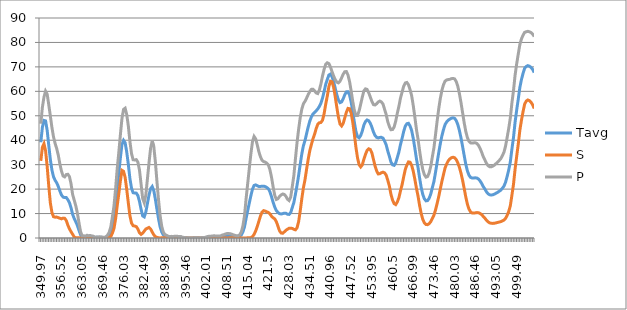
| Category | Tavg | S | P |
|---|---|---|---|
| 349.97 | 39.16 | 31.555 | 46.765 |
| 350.48 | 45.298 | 37.122 | 53.475 |
| 350.99 | 48.093 | 38.547 | 57.639 |
| 351.5 | 47.901 | 35.73 | 60.073 |
| 352.01 | 44.091 | 29.308 | 58.875 |
| 352.52 | 37.928 | 21.343 | 54.514 |
| 353.02 | 32.137 | 14.359 | 49.915 |
| 353.53 | 27.799 | 10.416 | 45.183 |
| 354.03 | 25.027 | 8.699 | 41.356 |
| 354.53 | 23.6 | 8.532 | 38.668 |
| 355.03 | 22.561 | 8.548 | 36.573 |
| 355.53 | 21.086 | 8.332 | 33.841 |
| 356.03 | 19.175 | 8.072 | 30.277 |
| 356.52 | 17.587 | 7.842 | 27.331 |
| 357.01 | 16.753 | 8.133 | 25.373 |
| 357.51 | 16.535 | 8.057 | 25.013 |
| 358.0 | 16.554 | 7.152 | 25.956 |
| 358.49 | 15.666 | 5.267 | 26.065 |
| 358.97 | 14.422 | 3.735 | 25.109 |
| 359.46 | 12.384 | 2.574 | 22.193 |
| 360.06 | 9.675 | 1.526 | 17.825 |
| 360.55 | 7.944 | 0.421 | 15.466 |
| 361.03 | 6.59 | 0.038 | 13.141 |
| 361.5 | 5.116 | 0.077 | 10.156 |
| 361.98 | 3.133 | 0.077 | 6.188 |
| 362.46 | 1.276 | 0 | 2.553 |
| 363.05 | 0.481 | 0.078 | 0.885 |
| 363.52 | 0.561 | 0.196 | 0.926 |
| 363.98 | 0.356 | 0 | 0.713 |
| 364.45 | 0.686 | 0.237 | 1.134 |
| 365.03 | 0.465 | 0 | 0.93 |
| 365.49 | 0.563 | 0.078 | 1.048 |
| 365.95 | 0.479 | 0.118 | 0.839 |
| 366.53 | 0.455 | 0.156 | 0.754 |
| 366.98 | 0.185 | 0.078 | 0.292 |
| 367.55 | 0.288 | 0.158 | 0.419 |
| 368.0 | 0.29 | 0.198 | 0.381 |
| 368.45 | 0.331 | 0.281 | 0.38 |
| 369.01 | 0.295 | 0.161 | 0.428 |
| 369.46 | 0.174 | 0 | 0.348 |
| 370.01 | 0.151 | 0.082 | 0.219 |
| 370.45 | 0.389 | 0.207 | 0.571 |
| 371.0 | 0.802 | 0.415 | 1.188 |
| 371.55 | 1.194 | 0 | 2.389 |
| 371.98 | 2.618 | 0.622 | 4.613 |
| 372.52 | 5.367 | 2.004 | 8.73 |
| 372.95 | 8.61 | 3.974 | 13.245 |
| 373.49 | 14.014 | 7.812 | 20.217 |
| 374.02 | 20.702 | 13.122 | 28.283 |
| 374.45 | 26.487 | 18.056 | 34.918 |
| 374.98 | 32.782 | 23.343 | 42.22 |
| 375.51 | 38.312 | 27.683 | 48.941 |
| 376.03 | 39.936 | 27.264 | 52.609 |
| 376.45 | 38.932 | 24.763 | 53.101 |
| 376.97 | 35.145 | 19.817 | 50.474 |
| 377.49 | 30.066 | 14.314 | 45.819 |
| 378.01 | 24.27 | 9.13 | 39.41 |
| 378.52 | 20.338 | 6.122 | 34.554 |
| 379.04 | 18.518 | 5.024 | 32.013 |
| 379.55 | 18.402 | 4.883 | 31.921 |
| 379.96 | 18.359 | 4.658 | 32.06 |
| 380.47 | 17.346 | 3.653 | 31.039 |
| 380.97 | 14.967 | 2.115 | 27.819 |
| 381.48 | 11.777 | 1.475 | 22.08 |
| 381.98 | 9.054 | 1.959 | 16.149 |
| 382.49 | 8.633 | 2.841 | 14.426 |
| 382.99 | 10.648 | 3.679 | 17.616 |
| 383.49 | 14.117 | 4.005 | 24.229 |
| 383.99 | 17.59 | 4.33 | 30.85 |
| 384.49 | 20.206 | 3.685 | 36.727 |
| 384.99 | 21.055 | 2.432 | 39.677 |
| 385.49 | 19.35 | 1.305 | 37.395 |
| 385.99 | 15.795 | 0.532 | 31.058 |
| 386.49 | 11.602 | 0.261 | 22.943 |
| 386.99 | 7.741 | 0.102 | 15.381 |
| 387.49 | 4.504 | 0 | 9.008 |
| 387.99 | 2.434 | 0.148 | 4.719 |
| 388.48 | 1.242 | 0.145 | 2.338 |
| 388.98 | 0.742 | 0.095 | 1.389 |
| 389.48 | 0.541 | 0 | 1.083 |
| 389.98 | 0.369 | 0 | 0.738 |
| 390.49 | 0.296 | 0 | 0.592 |
| 390.99 | 0.336 | 0 | 0.672 |
| 391.49 | 0.33 | 0.044 | 0.616 |
| 392.0 | 0.347 | 0 | 0.695 |
| 392.5 | 0.363 | 0 | 0.726 |
| 393.01 | 0.336 | 0 | 0.673 |
| 393.51 | 0.329 | 0.041 | 0.618 |
| 394.02 | 0.304 | 0 | 0.609 |
| 394.54 | 0.18 | 0.04 | 0.32 |
| 395.05 | 0.119 | 0 | 0.237 |
| 395.46 | 0.136 | 0.116 | 0.156 |
| 395.97 | 0.058 | 0.038 | 0.077 |
| 396.49 | 0.038 | 0 | 0.076 |
| 397.01 | 0.019 | 0.037 | 0 |
| 397.53 | 0.018 | 0 | 0.037 |
| 397.95 | 0.073 | 0.072 | 0.073 |
| 398.48 | 0.054 | 0 | 0.108 |
| 399.01 | 0.053 | 0.035 | 0.071 |
| 399.54 | 0.087 | 0.069 | 0.104 |
| 399.96 | 0.034 | 0.034 | 0.035 |
| 400.5 | 0.068 | 0 | 0.136 |
| 401.04 | 0.084 | 0 | 0.168 |
| 401.47 | 0.133 | 0.066 | 0.199 |
| 402.01 | 0.229 | 0.033 | 0.426 |
| 402.45 | 0.325 | 0 | 0.65 |
| 402.99 | 0.352 | 0 | 0.704 |
| 403.54 | 0.411 | 0.063 | 0.759 |
| 403.99 | 0.453 | 0.062 | 0.844 |
| 404.54 | 0.448 | 0 | 0.896 |
| 404.99 | 0.413 | 0 | 0.827 |
| 405.55 | 0.423 | 0.03 | 0.816 |
| 406.0 | 0.405 | 0 | 0.81 |
| 406.45 | 0.46 | 0.059 | 0.86 |
| 407.02 | 0.644 | 0.088 | 1.201 |
| 407.48 | 0.695 | 0.029 | 1.362 |
| 408.05 | 0.846 | 0.057 | 1.634 |
| 408.51 | 0.906 | 0 | 1.813 |
| 408.97 | 0.941 | 0.057 | 1.826 |
| 409.55 | 0.903 | 0.056 | 1.751 |
| 410.02 | 0.824 | 0.111 | 1.538 |
| 410.49 | 0.681 | 0.082 | 1.281 |
| 410.96 | 0.581 | 0.081 | 1.081 |
| 411.55 | 0.522 | 0.108 | 0.936 |
| 412.03 | 0.504 | 0.053 | 0.955 |
| 412.5 | 0.736 | 0.132 | 1.341 |
| 412.98 | 1.264 | 0.026 | 2.502 |
| 413.46 | 2.514 | 0.052 | 4.976 |
| 413.94 | 4.594 | 0.026 | 9.162 |
| 414.55 | 8.071 | 0 | 16.143 |
| 415.04 | 11.21 | 0.101 | 22.319 |
| 415.52 | 14.301 | 0.1 | 28.502 |
| 416.01 | 17.319 | 0.15 | 34.489 |
| 416.5 | 19.989 | 0.566 | 39.412 |
| 417.0 | 21.506 | 1.46 | 41.551 |
| 417.49 | 21.727 | 2.88 | 40.575 |
| 417.99 | 21.394 | 4.699 | 38.09 |
| 418.48 | 21.076 | 6.831 | 35.322 |
| 418.98 | 21.093 | 8.966 | 33.219 |
| 419.48 | 21.207 | 10.603 | 31.81 |
| 419.98 | 21.218 | 11.187 | 31.249 |
| 420.49 | 21.035 | 11.01 | 31.06 |
| 420.99 | 20.653 | 10.71 | 30.596 |
| 421.5 | 20.128 | 10.425 | 29.83 |
| 422.0 | 18.827 | 9.825 | 27.83 |
| 422.51 | 16.801 | 8.871 | 24.731 |
| 423.02 | 14.525 | 8.275 | 20.774 |
| 423.53 | 12.593 | 7.784 | 17.401 |
| 424.04 | 11.225 | 6.671 | 15.779 |
| 424.55 | 10.464 | 4.848 | 16.081 |
| 425.06 | 9.958 | 2.924 | 16.993 |
| 425.45 | 9.835 | 2.053 | 17.617 |
| 425.96 | 9.967 | 1.933 | 18 |
| 426.48 | 10.169 | 2.523 | 17.816 |
| 426.99 | 10.109 | 3.167 | 17.051 |
| 427.51 | 9.732 | 3.605 | 15.86 |
| 428.03 | 9.651 | 3.971 | 15.33 |
| 428.54 | 10.375 | 4.024 | 16.726 |
| 429.06 | 12.467 | 3.9 | 21.034 |
| 429.45 | 14.568 | 3.557 | 25.578 |
| 429.97 | 17.918 | 3.345 | 32.49 |
| 430.49 | 21.628 | 4.19 | 39.065 |
| 431.01 | 25.623 | 6.716 | 44.531 |
| 431.52 | 30.174 | 11.078 | 49.271 |
| 432.04 | 34.436 | 16.134 | 52.738 |
| 432.56 | 37.757 | 20.597 | 54.916 |
| 432.95 | 39.9 | 23.87 | 55.93 |
| 433.47 | 42.7 | 28.164 | 57.236 |
| 433.99 | 45.431 | 32.184 | 58.677 |
| 434.51 | 47.805 | 35.7 | 59.91 |
| 435.03 | 49.521 | 38.227 | 60.815 |
| 435.55 | 50.719 | 40.569 | 60.869 |
| 435.94 | 51.318 | 42.415 | 60.222 |
| 436.46 | 52.029 | 44.717 | 59.342 |
| 436.97 | 52.797 | 46.498 | 59.096 |
| 437.49 | 53.795 | 47.134 | 60.457 |
| 438.01 | 55.151 | 47.259 | 63.044 |
| 438.52 | 57.232 | 48.177 | 66.286 |
| 439.04 | 59.906 | 50.82 | 68.992 |
| 439.55 | 62.888 | 54.738 | 71.039 |
| 439.94 | 64.853 | 58.034 | 71.672 |
| 440.45 | 66.662 | 61.979 | 71.345 |
| 440.96 | 67.047 | 64.14 | 69.954 |
| 441.48 | 65.96 | 63.903 | 68.017 |
| 441.99 | 63.891 | 61.558 | 66.223 |
| 442.5 | 61.244 | 57.722 | 64.765 |
| 443.0 | 58.575 | 53.382 | 63.768 |
| 443.51 | 56.446 | 49.429 | 63.464 |
| 444.02 | 55.381 | 46.617 | 64.146 |
| 444.52 | 55.679 | 45.84 | 65.518 |
| 445.03 | 56.969 | 46.888 | 67.051 |
| 445.53 | 58.61 | 49.186 | 68.033 |
| 446.03 | 59.78 | 51.474 | 68.087 |
| 446.53 | 59.841 | 53.012 | 66.67 |
| 447.03 | 58.428 | 52.898 | 63.958 |
| 447.52 | 55.581 | 51.059 | 60.103 |
| 448.02 | 51.642 | 47.392 | 55.892 |
| 448.51 | 47.327 | 42.458 | 52.196 |
| 449.0 | 43.6 | 37.073 | 50.127 |
| 449.49 | 41.443 | 32.765 | 50.121 |
| 449.98 | 40.991 | 29.982 | 52 |
| 450.47 | 41.938 | 29.084 | 54.792 |
| 450.96 | 43.786 | 29.93 | 57.642 |
| 451.56 | 46.23 | 32.246 | 60.214 |
| 452.04 | 47.627 | 34.24 | 61.015 |
| 452.52 | 48.294 | 35.803 | 60.786 |
| 453.0 | 47.981 | 36.491 | 59.471 |
| 453.48 | 46.96 | 36.205 | 57.715 |
| 453.95 | 45.386 | 34.874 | 55.898 |
| 454.54 | 43.354 | 32.138 | 54.57 |
| 455.01 | 41.96 | 29.506 | 54.413 |
| 455.48 | 41.186 | 27.466 | 54.907 |
| 456.06 | 40.936 | 26.2 | 55.672 |
| 456.52 | 41.16 | 26.309 | 56.011 |
| 456.99 | 41.17 | 26.689 | 55.651 |
| 457.45 | 40.861 | 26.939 | 54.783 |
| 458.02 | 39.642 | 26.643 | 52.641 |
| 458.47 | 38.113 | 25.732 | 50.494 |
| 459.04 | 35.572 | 23.617 | 47.527 |
| 459.49 | 33.433 | 21.271 | 45.594 |
| 460.05 | 31.08 | 17.856 | 44.304 |
| 460.5 | 29.953 | 15.532 | 44.374 |
| 460.95 | 29.738 | 14.064 | 45.412 |
| 461.5 | 30.747 | 13.662 | 47.832 |
| 462.05 | 32.923 | 14.767 | 51.078 |
| 462.49 | 35.216 | 16.527 | 53.905 |
| 463.04 | 38.285 | 19.312 | 57.258 |
| 463.47 | 40.764 | 21.832 | 59.696 |
| 464.01 | 43.573 | 25.037 | 62.109 |
| 464.55 | 45.722 | 28.018 | 63.426 |
| 464.98 | 46.752 | 29.874 | 63.63 |
| 465.51 | 46.926 | 31.137 | 62.715 |
| 466.04 | 45.83 | 30.979 | 60.68 |
| 466.47 | 43.989 | 29.759 | 58.218 |
| 466.99 | 40.78 | 27.347 | 54.212 |
| 467.52 | 36.788 | 24.055 | 49.52 |
| 468.04 | 32.45 | 20.414 | 44.487 |
| 468.46 | 28.868 | 17.214 | 40.522 |
| 468.97 | 24.513 | 13.339 | 35.687 |
| 469.49 | 20.643 | 9.998 | 31.289 |
| 470.0 | 17.8 | 7.611 | 27.989 |
| 470.52 | 16.02 | 6.184 | 25.856 |
| 471.03 | 15.207 | 5.514 | 24.901 |
| 471.54 | 15.296 | 5.458 | 25.134 |
| 472.04 | 16.252 | 5.866 | 26.638 |
| 472.55 | 18.002 | 6.694 | 29.31 |
| 473.05 | 20.589 | 7.995 | 33.182 |
| 473.46 | 23.107 | 9.333 | 36.881 |
| 473.96 | 26.879 | 11.477 | 42.28 |
| 474.46 | 30.908 | 14.078 | 47.737 |
| 474.96 | 34.848 | 16.924 | 52.773 |
| 475.46 | 38.543 | 20.061 | 57.025 |
| 475.96 | 41.775 | 23.17 | 60.381 |
| 476.46 | 44.32 | 25.948 | 62.693 |
| 477.05 | 46.416 | 28.65 | 64.183 |
| 477.55 | 47.477 | 30.302 | 64.653 |
| 478.05 | 48.211 | 31.601 | 64.82 |
| 478.54 | 48.631 | 32.351 | 64.911 |
| 479.04 | 49.01 | 32.826 | 65.194 |
| 479.54 | 49.152 | 33.033 | 65.272 |
| 480.03 | 48.963 | 32.836 | 65.09 |
| 480.53 | 48.028 | 32.074 | 63.983 |
| 481.03 | 46.388 | 30.745 | 62.032 |
| 481.53 | 43.999 | 28.915 | 59.083 |
| 482.03 | 40.962 | 26.533 | 55.392 |
| 482.52 | 37.466 | 23.631 | 51.3 |
| 483.03 | 33.761 | 20.33 | 47.193 |
| 483.53 | 30.238 | 16.837 | 43.64 |
| 484.03 | 27.507 | 13.9 | 41.114 |
| 484.53 | 25.716 | 11.88 | 39.552 |
| 485.04 | 24.802 | 10.697 | 38.908 |
| 485.55 | 24.547 | 10.237 | 38.857 |
| 486.05 | 24.557 | 10.195 | 38.919 |
| 486.46 | 24.62 | 10.294 | 38.946 |
| 486.97 | 24.528 | 10.396 | 38.66 |
| 487.49 | 24.116 | 10.353 | 37.878 |
| 488.0 | 23.346 | 10.044 | 36.648 |
| 488.52 | 22.3 | 9.545 | 35.054 |
| 489.04 | 21.042 | 8.825 | 33.259 |
| 489.45 | 20.028 | 8.122 | 31.934 |
| 489.97 | 18.91 | 7.266 | 30.555 |
| 490.5 | 18.109 | 6.613 | 29.606 |
| 491.03 | 17.679 | 6.184 | 29.174 |
| 491.45 | 17.58 | 6.028 | 29.131 |
| 491.98 | 17.686 | 5.97 | 29.403 |
| 492.52 | 17.941 | 6.045 | 29.837 |
| 493.05 | 18.312 | 6.188 | 30.436 |
| 493.49 | 18.67 | 6.362 | 30.978 |
| 494.03 | 19.116 | 6.519 | 31.712 |
| 494.46 | 19.574 | 6.693 | 32.454 |
| 495.01 | 20.341 | 6.999 | 33.683 |
| 495.45 | 21.206 | 7.324 | 35.088 |
| 496.0 | 22.812 | 8.037 | 37.586 |
| 496.56 | 25.203 | 9.251 | 41.155 |
| 497.0 | 27.841 | 10.839 | 44.843 |
| 497.45 | 31.167 | 13.201 | 49.134 |
| 498.01 | 36.397 | 17.517 | 55.277 |
| 498.46 | 41.184 | 22.014 | 60.353 |
| 499.03 | 47.455 | 28.234 | 66.676 |
| 499.49 | 52.372 | 33.446 | 71.297 |
| 499.95 | 56.893 | 38.484 | 75.302 |
| 500.52 | 61.669 | 44.158 | 79.18 |
| 500.98 | 64.838 | 48.222 | 81.453 |
| 501.45 | 67.357 | 51.725 | 82.99 |
| 502.03 | 69.456 | 54.769 | 84.142 |
| 502.5 | 70.197 | 56.017 | 84.377 |
| 502.97 | 70.499 | 56.459 | 84.538 |
| 503.56 | 70.276 | 56.179 | 84.373 |
| 504.03 | 69.776 | 55.527 | 84.025 |
| 504.51 | 68.982 | 54.51 | 83.454 |
| 504.99 | 67.696 | 52.98 | 82.412 |